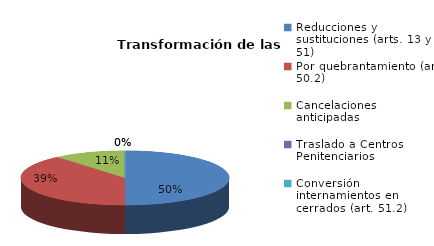
| Category | Series 0 |
|---|---|
| Reducciones y sustituciones (arts. 13 y 51) | 18 |
| Por quebrantamiento (art. 50.2) | 14 |
| Cancelaciones anticipadas | 4 |
| Traslado a Centros Penitenciarios | 0 |
| Conversión internamientos en cerrados (art. 51.2) | 0 |